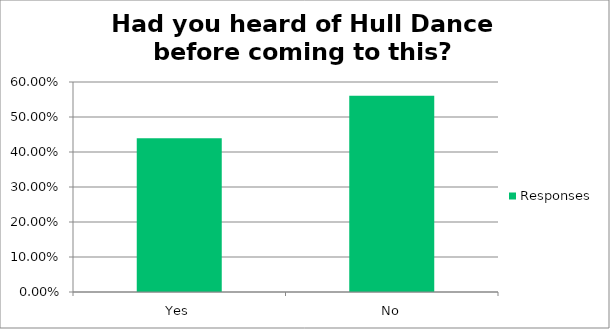
| Category | Responses |
|---|---|
| Yes | 0.439 |
| No | 0.561 |